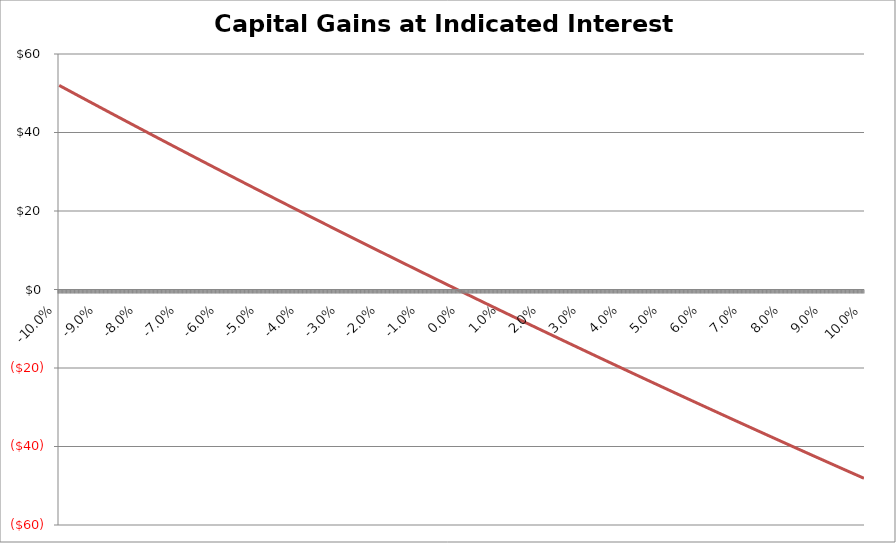
| Category | Capital Gains |
|---|---|
| -0.1 | 52 |
| -0.0999 | 51.945 |
| -0.0998 | 51.889 |
| -0.0997 | 51.834 |
| -0.0996 | 51.779 |
| -0.0995 | 51.723 |
| -0.0994 | 51.668 |
| -0.0993 | 51.613 |
| -0.0992 | 51.557 |
| -0.0991 | 51.502 |
| -0.099 | 51.447 |
| -0.0988999999999999 | 51.391 |
| -0.0987999999999999 | 51.336 |
| -0.0986999999999999 | 51.281 |
| -0.0985999999999999 | 51.225 |
| -0.0984999999999999 | 51.17 |
| -0.0983999999999999 | 51.115 |
| -0.0982999999999999 | 51.06 |
| -0.0981999999999999 | 51.004 |
| -0.0980999999999999 | 50.949 |
| -0.0979999999999999 | 50.894 |
| -0.0978999999999999 | 50.839 |
| -0.0977999999999999 | 50.783 |
| -0.0976999999999999 | 50.728 |
| -0.0975999999999999 | 50.673 |
| -0.0974999999999999 | 50.618 |
| -0.0973999999999999 | 50.562 |
| -0.0972999999999999 | 50.507 |
| -0.0971999999999999 | 50.452 |
| -0.0970999999999999 | 50.397 |
| -0.0969999999999999 | 50.342 |
| -0.0968999999999999 | 50.286 |
| -0.0967999999999999 | 50.231 |
| -0.0966999999999999 | 50.176 |
| -0.0965999999999999 | 50.121 |
| -0.0964999999999999 | 50.066 |
| -0.0963999999999999 | 50.011 |
| -0.0962999999999999 | 49.955 |
| -0.0961999999999999 | 49.9 |
| -0.0960999999999999 | 49.845 |
| -0.0959999999999999 | 49.79 |
| -0.0958999999999999 | 49.735 |
| -0.0957999999999999 | 49.68 |
| -0.0956999999999999 | 49.625 |
| -0.0955999999999999 | 49.569 |
| -0.0954999999999999 | 49.514 |
| -0.0953999999999998 | 49.459 |
| -0.0952999999999998 | 49.404 |
| -0.0951999999999998 | 49.349 |
| -0.0950999999999998 | 49.294 |
| -0.0949999999999998 | 49.239 |
| -0.0948999999999998 | 49.184 |
| -0.0947999999999998 | 49.129 |
| -0.0946999999999998 | 49.074 |
| -0.0945999999999998 | 49.019 |
| -0.0944999999999998 | 48.964 |
| -0.0943999999999998 | 48.908 |
| -0.0942999999999998 | 48.853 |
| -0.0941999999999998 | 48.798 |
| -0.0940999999999998 | 48.743 |
| -0.0939999999999998 | 48.688 |
| -0.0938999999999998 | 48.633 |
| -0.0937999999999998 | 48.578 |
| -0.0936999999999998 | 48.523 |
| -0.0935999999999998 | 48.468 |
| -0.0934999999999998 | 48.413 |
| -0.0933999999999998 | 48.358 |
| -0.0932999999999998 | 48.303 |
| -0.0931999999999998 | 48.248 |
| -0.0930999999999998 | 48.193 |
| -0.0929999999999998 | 48.138 |
| -0.0928999999999998 | 48.083 |
| -0.0927999999999998 | 48.029 |
| -0.0926999999999998 | 47.974 |
| -0.0925999999999998 | 47.919 |
| -0.0924999999999998 | 47.864 |
| -0.0923999999999998 | 47.809 |
| -0.0922999999999998 | 47.754 |
| -0.0921999999999998 | 47.699 |
| -0.0920999999999998 | 47.644 |
| -0.0919999999999998 | 47.589 |
| -0.0918999999999997 | 47.534 |
| -0.0917999999999997 | 47.479 |
| -0.0916999999999997 | 47.424 |
| -0.0915999999999997 | 47.37 |
| -0.0914999999999997 | 47.315 |
| -0.0913999999999997 | 47.26 |
| -0.0912999999999997 | 47.205 |
| -0.0911999999999997 | 47.15 |
| -0.0910999999999997 | 47.095 |
| -0.0909999999999997 | 47.04 |
| -0.0908999999999997 | 46.985 |
| -0.0907999999999997 | 46.931 |
| -0.0906999999999997 | 46.876 |
| -0.0905999999999997 | 46.821 |
| -0.0904999999999997 | 46.766 |
| -0.0903999999999997 | 46.711 |
| -0.0902999999999997 | 46.657 |
| -0.0901999999999997 | 46.602 |
| -0.0900999999999997 | 46.547 |
| -0.0899999999999997 | 46.492 |
| -0.0898999999999997 | 46.437 |
| -0.0897999999999997 | 46.383 |
| -0.0896999999999997 | 46.328 |
| -0.0895999999999997 | 46.273 |
| -0.0894999999999997 | 46.218 |
| -0.0893999999999997 | 46.164 |
| -0.0892999999999997 | 46.109 |
| -0.0891999999999997 | 46.054 |
| -0.0890999999999997 | 45.999 |
| -0.0889999999999997 | 45.945 |
| -0.0888999999999997 | 45.89 |
| -0.0887999999999997 | 45.835 |
| -0.0886999999999997 | 45.78 |
| -0.0885999999999997 | 45.726 |
| -0.0884999999999997 | 45.671 |
| -0.0883999999999997 | 45.616 |
| -0.0882999999999997 | 45.562 |
| -0.0881999999999997 | 45.507 |
| -0.0880999999999996 | 45.452 |
| -0.0879999999999996 | 45.397 |
| -0.0878999999999996 | 45.343 |
| -0.0877999999999996 | 45.288 |
| -0.0876999999999996 | 45.233 |
| -0.0875999999999996 | 45.179 |
| -0.0874999999999996 | 45.124 |
| -0.0873999999999996 | 45.07 |
| -0.0872999999999996 | 45.015 |
| -0.0871999999999996 | 44.96 |
| -0.0870999999999996 | 44.906 |
| -0.0869999999999996 | 44.851 |
| -0.0868999999999996 | 44.796 |
| -0.0867999999999996 | 44.742 |
| -0.0866999999999996 | 44.687 |
| -0.0865999999999996 | 44.633 |
| -0.0864999999999996 | 44.578 |
| -0.0863999999999996 | 44.523 |
| -0.0862999999999996 | 44.469 |
| -0.0861999999999996 | 44.414 |
| -0.0860999999999996 | 44.36 |
| -0.0859999999999996 | 44.305 |
| -0.0858999999999996 | 44.251 |
| -0.0857999999999996 | 44.196 |
| -0.0856999999999996 | 44.141 |
| -0.0855999999999996 | 44.087 |
| -0.0854999999999996 | 44.032 |
| -0.0853999999999996 | 43.978 |
| -0.0852999999999996 | 43.923 |
| -0.0851999999999996 | 43.869 |
| -0.0850999999999996 | 43.814 |
| -0.0849999999999996 | 43.76 |
| -0.0848999999999996 | 43.705 |
| -0.0847999999999996 | 43.651 |
| -0.0846999999999996 | 43.596 |
| -0.0845999999999995 | 43.542 |
| -0.0844999999999995 | 43.487 |
| -0.0843999999999995 | 43.433 |
| -0.0842999999999995 | 43.378 |
| -0.0841999999999995 | 43.324 |
| -0.0840999999999995 | 43.269 |
| -0.0839999999999995 | 43.215 |
| -0.0838999999999995 | 43.161 |
| -0.0837999999999995 | 43.106 |
| -0.0836999999999995 | 43.052 |
| -0.0835999999999995 | 42.997 |
| -0.0834999999999995 | 42.943 |
| -0.0833999999999995 | 42.888 |
| -0.0832999999999995 | 42.834 |
| -0.0831999999999995 | 42.78 |
| -0.0830999999999995 | 42.725 |
| -0.0829999999999995 | 42.671 |
| -0.0828999999999995 | 42.616 |
| -0.0827999999999995 | 42.562 |
| -0.0826999999999995 | 42.508 |
| -0.0825999999999995 | 42.453 |
| -0.0824999999999995 | 42.399 |
| -0.0823999999999995 | 42.345 |
| -0.0822999999999995 | 42.29 |
| -0.0821999999999995 | 42.236 |
| -0.0820999999999995 | 42.182 |
| -0.0819999999999995 | 42.127 |
| -0.0818999999999995 | 42.073 |
| -0.0817999999999995 | 42.019 |
| -0.0816999999999995 | 41.964 |
| -0.0815999999999995 | 41.91 |
| -0.0814999999999995 | 41.856 |
| -0.0813999999999995 | 41.801 |
| -0.0812999999999995 | 41.747 |
| -0.0811999999999995 | 41.693 |
| -0.0810999999999994 | 41.638 |
| -0.0809999999999994 | 41.584 |
| -0.0808999999999994 | 41.53 |
| -0.0807999999999994 | 41.476 |
| -0.0806999999999994 | 41.421 |
| -0.0805999999999994 | 41.367 |
| -0.0804999999999994 | 41.313 |
| -0.0803999999999994 | 41.259 |
| -0.0802999999999994 | 41.204 |
| -0.0801999999999994 | 41.15 |
| -0.0800999999999994 | 41.096 |
| -0.0799999999999994 | 41.042 |
| -0.0798999999999994 | 40.987 |
| -0.0797999999999994 | 40.933 |
| -0.0796999999999994 | 40.879 |
| -0.0795999999999994 | 40.825 |
| -0.0794999999999994 | 40.771 |
| -0.0793999999999994 | 40.716 |
| -0.0792999999999994 | 40.662 |
| -0.0791999999999994 | 40.608 |
| -0.0790999999999994 | 40.554 |
| -0.0789999999999994 | 40.5 |
| -0.0788999999999994 | 40.446 |
| -0.0787999999999994 | 40.391 |
| -0.0786999999999994 | 40.337 |
| -0.0785999999999994 | 40.283 |
| -0.0784999999999994 | 40.229 |
| -0.0783999999999994 | 40.175 |
| -0.0782999999999994 | 40.121 |
| -0.0781999999999994 | 40.067 |
| -0.0780999999999994 | 40.012 |
| -0.0779999999999994 | 39.958 |
| -0.0778999999999994 | 39.904 |
| -0.0777999999999994 | 39.85 |
| -0.0776999999999994 | 39.796 |
| -0.0775999999999994 | 39.742 |
| -0.0774999999999994 | 39.688 |
| -0.0773999999999993 | 39.634 |
| -0.0772999999999993 | 39.58 |
| -0.0771999999999993 | 39.526 |
| -0.0770999999999993 | 39.472 |
| -0.0769999999999993 | 39.418 |
| -0.0768999999999993 | 39.364 |
| -0.0767999999999993 | 39.309 |
| -0.0766999999999993 | 39.255 |
| -0.0765999999999993 | 39.201 |
| -0.0764999999999993 | 39.147 |
| -0.0763999999999993 | 39.093 |
| -0.0762999999999993 | 39.039 |
| -0.0761999999999993 | 38.985 |
| -0.0760999999999993 | 38.931 |
| -0.0759999999999993 | 38.877 |
| -0.0758999999999993 | 38.823 |
| -0.0757999999999993 | 38.769 |
| -0.0756999999999993 | 38.715 |
| -0.0755999999999993 | 38.661 |
| -0.0754999999999993 | 38.607 |
| -0.0753999999999993 | 38.553 |
| -0.0752999999999993 | 38.5 |
| -0.0751999999999993 | 38.446 |
| -0.0750999999999993 | 38.392 |
| -0.0749999999999993 | 38.338 |
| -0.0748999999999993 | 38.284 |
| -0.0747999999999993 | 38.23 |
| -0.0746999999999993 | 38.176 |
| -0.0745999999999993 | 38.122 |
| -0.0744999999999993 | 38.068 |
| -0.0743999999999993 | 38.014 |
| -0.0742999999999993 | 37.96 |
| -0.0741999999999993 | 37.906 |
| -0.0740999999999993 | 37.852 |
| -0.0739999999999993 | 37.799 |
| -0.0738999999999993 | 37.745 |
| -0.0737999999999992 | 37.691 |
| -0.0736999999999992 | 37.637 |
| -0.0735999999999992 | 37.583 |
| -0.0734999999999992 | 37.529 |
| -0.0733999999999992 | 37.475 |
| -0.0732999999999992 | 37.421 |
| -0.0731999999999992 | 37.368 |
| -0.0730999999999992 | 37.314 |
| -0.0729999999999992 | 37.26 |
| -0.0728999999999992 | 37.206 |
| -0.0727999999999992 | 37.152 |
| -0.0726999999999992 | 37.099 |
| -0.0725999999999992 | 37.045 |
| -0.0724999999999992 | 36.991 |
| -0.0723999999999992 | 36.937 |
| -0.0722999999999992 | 36.883 |
| -0.0721999999999992 | 36.83 |
| -0.0720999999999992 | 36.776 |
| -0.0719999999999992 | 36.722 |
| -0.0718999999999992 | 36.668 |
| -0.0717999999999992 | 36.614 |
| -0.0716999999999992 | 36.561 |
| -0.0715999999999992 | 36.507 |
| -0.0714999999999992 | 36.453 |
| -0.0713999999999992 | 36.399 |
| -0.0712999999999992 | 36.346 |
| -0.0711999999999992 | 36.292 |
| -0.0710999999999992 | 36.238 |
| -0.0709999999999992 | 36.185 |
| -0.0708999999999992 | 36.131 |
| -0.0707999999999992 | 36.077 |
| -0.0706999999999992 | 36.023 |
| -0.0705999999999992 | 35.97 |
| -0.0704999999999992 | 35.916 |
| -0.0703999999999992 | 35.862 |
| -0.0702999999999991 | 35.809 |
| -0.0701999999999991 | 35.755 |
| -0.0700999999999991 | 35.701 |
| -0.0699999999999991 | 35.648 |
| -0.0698999999999991 | 35.594 |
| -0.0697999999999991 | 35.54 |
| -0.0696999999999991 | 35.487 |
| -0.0695999999999991 | 35.433 |
| -0.0694999999999991 | 35.379 |
| -0.0693999999999991 | 35.326 |
| -0.0692999999999991 | 35.272 |
| -0.0691999999999991 | 35.219 |
| -0.0690999999999991 | 35.165 |
| -0.0689999999999991 | 35.111 |
| -0.0688999999999991 | 35.058 |
| -0.0687999999999991 | 35.004 |
| -0.0686999999999991 | 34.951 |
| -0.0685999999999991 | 34.897 |
| -0.0684999999999991 | 34.843 |
| -0.0683999999999991 | 34.79 |
| -0.0682999999999991 | 34.736 |
| -0.0681999999999991 | 34.683 |
| -0.0680999999999991 | 34.629 |
| -0.0679999999999991 | 34.576 |
| -0.0678999999999991 | 34.522 |
| -0.0677999999999991 | 34.468 |
| -0.0676999999999991 | 34.415 |
| -0.0675999999999991 | 34.361 |
| -0.0674999999999991 | 34.308 |
| -0.0673999999999991 | 34.254 |
| -0.0672999999999991 | 34.201 |
| -0.0671999999999991 | 34.147 |
| -0.067099999999999 | 34.094 |
| -0.066999999999999 | 34.04 |
| -0.066899999999999 | 33.987 |
| -0.066799999999999 | 33.933 |
| -0.066699999999999 | 33.88 |
| -0.066599999999999 | 33.826 |
| -0.066499999999999 | 33.773 |
| -0.066399999999999 | 33.719 |
| -0.066299999999999 | 33.666 |
| -0.066199999999999 | 33.613 |
| -0.066099999999999 | 33.559 |
| -0.065999999999999 | 33.506 |
| -0.065899999999999 | 33.452 |
| -0.065799999999999 | 33.399 |
| -0.065699999999999 | 33.345 |
| -0.065599999999999 | 33.292 |
| -0.065499999999999 | 33.239 |
| -0.065399999999999 | 33.185 |
| -0.065299999999999 | 33.132 |
| -0.065199999999999 | 33.078 |
| -0.065099999999999 | 33.025 |
| -0.064999999999999 | 32.972 |
| -0.064899999999999 | 32.918 |
| -0.064799999999999 | 32.865 |
| -0.064699999999999 | 32.811 |
| -0.064599999999999 | 32.758 |
| -0.064499999999999 | 32.705 |
| -0.064399999999999 | 32.651 |
| -0.064299999999999 | 32.598 |
| -0.064199999999999 | 32.545 |
| -0.064099999999999 | 32.491 |
| -0.063999999999999 | 32.438 |
| -0.063899999999999 | 32.385 |
| -0.063799999999999 | 32.331 |
| -0.063699999999999 | 32.278 |
| -0.063599999999999 | 32.225 |
| -0.0634999999999989 | 32.171 |
| -0.0633999999999989 | 32.118 |
| -0.0632999999999989 | 32.065 |
| -0.0631999999999989 | 32.012 |
| -0.0630999999999989 | 31.958 |
| -0.0629999999999989 | 31.905 |
| -0.0628999999999989 | 31.852 |
| -0.0627999999999989 | 31.798 |
| -0.0626999999999989 | 31.745 |
| -0.0625999999999989 | 31.692 |
| -0.0624999999999989 | 31.639 |
| -0.0623999999999989 | 31.585 |
| -0.0622999999999989 | 31.532 |
| -0.0621999999999989 | 31.479 |
| -0.0620999999999989 | 31.426 |
| -0.0619999999999989 | 31.373 |
| -0.0618999999999989 | 31.319 |
| -0.0617999999999989 | 31.266 |
| -0.0616999999999989 | 31.213 |
| -0.0615999999999989 | 31.16 |
| -0.0614999999999989 | 31.107 |
| -0.0613999999999989 | 31.053 |
| -0.0612999999999989 | 31 |
| -0.0611999999999989 | 30.947 |
| -0.0610999999999989 | 30.894 |
| -0.0609999999999989 | 30.841 |
| -0.0608999999999989 | 30.787 |
| -0.0607999999999989 | 30.734 |
| -0.0606999999999989 | 30.681 |
| -0.0605999999999989 | 30.628 |
| -0.0604999999999989 | 30.575 |
| -0.0603999999999989 | 30.522 |
| -0.0602999999999989 | 30.469 |
| -0.0601999999999989 | 30.416 |
| -0.0600999999999989 | 30.362 |
| -0.0599999999999988 | 30.309 |
| -0.0598999999999988 | 30.256 |
| -0.0597999999999988 | 30.203 |
| -0.0596999999999988 | 30.15 |
| -0.0595999999999988 | 30.097 |
| -0.0594999999999988 | 30.044 |
| -0.0593999999999988 | 29.991 |
| -0.0592999999999988 | 29.938 |
| -0.0591999999999988 | 29.885 |
| -0.0590999999999988 | 29.832 |
| -0.0589999999999988 | 29.778 |
| -0.0588999999999988 | 29.725 |
| -0.0587999999999988 | 29.672 |
| -0.0586999999999988 | 29.619 |
| -0.0585999999999988 | 29.566 |
| -0.0584999999999988 | 29.513 |
| -0.0583999999999988 | 29.46 |
| -0.0582999999999988 | 29.407 |
| -0.0581999999999988 | 29.354 |
| -0.0580999999999988 | 29.301 |
| -0.0579999999999988 | 29.248 |
| -0.0578999999999988 | 29.195 |
| -0.0577999999999988 | 29.142 |
| -0.0576999999999988 | 29.089 |
| -0.0575999999999988 | 29.036 |
| -0.0574999999999988 | 28.983 |
| -0.0573999999999988 | 28.93 |
| -0.0572999999999988 | 28.877 |
| -0.0571999999999988 | 28.824 |
| -0.0570999999999988 | 28.771 |
| -0.0569999999999988 | 28.718 |
| -0.0568999999999988 | 28.666 |
| -0.0567999999999988 | 28.613 |
| -0.0566999999999988 | 28.56 |
| -0.0565999999999988 | 28.507 |
| -0.0564999999999987 | 28.454 |
| -0.0563999999999987 | 28.401 |
| -0.0562999999999987 | 28.348 |
| -0.0561999999999987 | 28.295 |
| -0.0560999999999987 | 28.242 |
| -0.0559999999999987 | 28.189 |
| -0.0558999999999987 | 28.136 |
| -0.0557999999999987 | 28.084 |
| -0.0556999999999987 | 28.031 |
| -0.0555999999999987 | 27.978 |
| -0.0554999999999987 | 27.925 |
| -0.0553999999999987 | 27.872 |
| -0.0552999999999987 | 27.819 |
| -0.0551999999999987 | 27.766 |
| -0.0550999999999987 | 27.714 |
| -0.0549999999999987 | 27.661 |
| -0.0548999999999987 | 27.608 |
| -0.0547999999999987 | 27.555 |
| -0.0546999999999987 | 27.502 |
| -0.0545999999999987 | 27.449 |
| -0.0544999999999987 | 27.397 |
| -0.0543999999999987 | 27.344 |
| -0.0542999999999987 | 27.291 |
| -0.0541999999999987 | 27.238 |
| -0.0540999999999987 | 27.185 |
| -0.0539999999999987 | 27.133 |
| -0.0538999999999987 | 27.08 |
| -0.0537999999999987 | 27.027 |
| -0.0536999999999987 | 26.974 |
| -0.0535999999999987 | 26.921 |
| -0.0534999999999987 | 26.869 |
| -0.0533999999999987 | 26.816 |
| -0.0532999999999987 | 26.763 |
| -0.0531999999999987 | 26.71 |
| -0.0530999999999987 | 26.658 |
| -0.0529999999999986 | 26.605 |
| -0.0528999999999986 | 26.552 |
| -0.0527999999999986 | 26.5 |
| -0.0526999999999986 | 26.447 |
| -0.0525999999999986 | 26.394 |
| -0.0524999999999986 | 26.341 |
| -0.0523999999999986 | 26.289 |
| -0.0522999999999986 | 26.236 |
| -0.0521999999999986 | 26.183 |
| -0.0520999999999986 | 26.131 |
| -0.0519999999999986 | 26.078 |
| -0.0518999999999986 | 26.025 |
| -0.0517999999999986 | 25.973 |
| -0.0516999999999986 | 25.92 |
| -0.0515999999999986 | 25.867 |
| -0.0514999999999986 | 25.815 |
| -0.0513999999999986 | 25.762 |
| -0.0512999999999986 | 25.709 |
| -0.0511999999999986 | 25.657 |
| -0.0510999999999986 | 25.604 |
| -0.0509999999999986 | 25.552 |
| -0.0508999999999986 | 25.499 |
| -0.0507999999999986 | 25.446 |
| -0.0506999999999986 | 25.394 |
| -0.0505999999999986 | 25.341 |
| -0.0504999999999986 | 25.289 |
| -0.0503999999999986 | 25.236 |
| -0.0502999999999986 | 25.183 |
| -0.0501999999999986 | 25.131 |
| -0.0500999999999986 | 25.078 |
| -0.0499999999999986 | 25.026 |
| -0.0498999999999986 | 24.973 |
| -0.0497999999999986 | 24.921 |
| -0.0496999999999986 | 24.868 |
| -0.0495999999999986 | 24.815 |
| -0.0494999999999985 | 24.763 |
| -0.0493999999999985 | 24.71 |
| -0.0492999999999985 | 24.658 |
| -0.0491999999999985 | 24.605 |
| -0.0490999999999985 | 24.553 |
| -0.0489999999999985 | 24.5 |
| -0.0488999999999985 | 24.448 |
| -0.0487999999999985 | 24.395 |
| -0.0486999999999985 | 24.343 |
| -0.0485999999999985 | 24.29 |
| -0.0484999999999985 | 24.238 |
| -0.0483999999999985 | 24.185 |
| -0.0482999999999985 | 24.133 |
| -0.0481999999999985 | 24.08 |
| -0.0480999999999985 | 24.028 |
| -0.0479999999999985 | 23.975 |
| -0.0478999999999985 | 23.923 |
| -0.0477999999999985 | 23.871 |
| -0.0476999999999985 | 23.818 |
| -0.0475999999999985 | 23.766 |
| -0.0474999999999985 | 23.713 |
| -0.0473999999999985 | 23.661 |
| -0.0472999999999985 | 23.608 |
| -0.0471999999999985 | 23.556 |
| -0.0470999999999985 | 23.504 |
| -0.0469999999999985 | 23.451 |
| -0.0468999999999985 | 23.399 |
| -0.0467999999999985 | 23.346 |
| -0.0466999999999985 | 23.294 |
| -0.0465999999999985 | 23.242 |
| -0.0464999999999985 | 23.189 |
| -0.0463999999999985 | 23.137 |
| -0.0462999999999985 | 23.084 |
| -0.0461999999999985 | 23.032 |
| -0.0460999999999985 | 22.98 |
| -0.0459999999999984 | 22.927 |
| -0.0458999999999984 | 22.875 |
| -0.0457999999999984 | 22.823 |
| -0.0456999999999984 | 22.77 |
| -0.0455999999999984 | 22.718 |
| -0.0454999999999984 | 22.666 |
| -0.0453999999999984 | 22.613 |
| -0.0452999999999984 | 22.561 |
| -0.0451999999999984 | 22.509 |
| -0.0450999999999984 | 22.456 |
| -0.0449999999999984 | 22.404 |
| -0.0448999999999984 | 22.352 |
| -0.0447999999999984 | 22.3 |
| -0.0446999999999984 | 22.247 |
| -0.0445999999999984 | 22.195 |
| -0.0444999999999984 | 22.143 |
| -0.0443999999999984 | 22.09 |
| -0.0442999999999984 | 22.038 |
| -0.0441999999999984 | 21.986 |
| -0.0440999999999984 | 21.934 |
| -0.0439999999999984 | 21.881 |
| -0.0438999999999984 | 21.829 |
| -0.0437999999999984 | 21.777 |
| -0.0436999999999984 | 21.725 |
| -0.0435999999999984 | 21.672 |
| -0.0434999999999984 | 21.62 |
| -0.0433999999999984 | 21.568 |
| -0.0432999999999984 | 21.516 |
| -0.0431999999999984 | 21.464 |
| -0.0430999999999984 | 21.411 |
| -0.0429999999999984 | 21.359 |
| -0.0428999999999984 | 21.307 |
| -0.0427999999999984 | 21.255 |
| -0.0426999999999984 | 21.203 |
| -0.0425999999999984 | 21.151 |
| -0.0424999999999984 | 21.098 |
| -0.0423999999999983 | 21.046 |
| -0.0422999999999983 | 20.994 |
| -0.0421999999999983 | 20.942 |
| -0.0420999999999983 | 20.89 |
| -0.0419999999999983 | 20.838 |
| -0.0418999999999983 | 20.785 |
| -0.0417999999999983 | 20.733 |
| -0.0416999999999983 | 20.681 |
| -0.0415999999999983 | 20.629 |
| -0.0414999999999983 | 20.577 |
| -0.0413999999999983 | 20.525 |
| -0.0412999999999983 | 20.473 |
| -0.0411999999999983 | 20.421 |
| -0.0410999999999983 | 20.369 |
| -0.0409999999999983 | 20.316 |
| -0.0408999999999983 | 20.264 |
| -0.0407999999999983 | 20.212 |
| -0.0406999999999983 | 20.16 |
| -0.0405999999999983 | 20.108 |
| -0.0404999999999983 | 20.056 |
| -0.0403999999999983 | 20.004 |
| -0.0402999999999983 | 19.952 |
| -0.0401999999999983 | 19.9 |
| -0.0400999999999983 | 19.848 |
| -0.0399999999999983 | 19.796 |
| -0.0398999999999983 | 19.744 |
| -0.0397999999999983 | 19.692 |
| -0.0396999999999983 | 19.64 |
| -0.0395999999999983 | 19.588 |
| -0.0394999999999983 | 19.536 |
| -0.0393999999999983 | 19.484 |
| -0.0392999999999983 | 19.432 |
| -0.0391999999999983 | 19.38 |
| -0.0390999999999983 | 19.328 |
| -0.0389999999999983 | 19.276 |
| -0.0388999999999982 | 19.224 |
| -0.0387999999999982 | 19.172 |
| -0.0386999999999982 | 19.12 |
| -0.0385999999999982 | 19.068 |
| -0.0384999999999982 | 19.016 |
| -0.0383999999999982 | 18.964 |
| -0.0382999999999982 | 18.912 |
| -0.0381999999999982 | 18.86 |
| -0.0380999999999982 | 18.808 |
| -0.0379999999999982 | 18.756 |
| -0.0378999999999982 | 18.704 |
| -0.0377999999999982 | 18.653 |
| -0.0376999999999982 | 18.601 |
| -0.0375999999999982 | 18.549 |
| -0.0374999999999982 | 18.497 |
| -0.0373999999999982 | 18.445 |
| -0.0372999999999982 | 18.393 |
| -0.0371999999999982 | 18.341 |
| -0.0370999999999982 | 18.289 |
| -0.0369999999999982 | 18.237 |
| -0.0368999999999982 | 18.186 |
| -0.0367999999999982 | 18.134 |
| -0.0366999999999982 | 18.082 |
| -0.0365999999999982 | 18.03 |
| -0.0364999999999982 | 17.978 |
| -0.0363999999999982 | 17.926 |
| -0.0362999999999982 | 17.874 |
| -0.0361999999999982 | 17.823 |
| -0.0360999999999982 | 17.771 |
| -0.0359999999999982 | 17.719 |
| -0.0358999999999982 | 17.667 |
| -0.0357999999999982 | 17.615 |
| -0.0356999999999982 | 17.564 |
| -0.0355999999999982 | 17.512 |
| -0.0354999999999982 | 17.46 |
| -0.0353999999999981 | 17.408 |
| -0.0352999999999981 | 17.356 |
| -0.0351999999999981 | 17.305 |
| -0.0350999999999981 | 17.253 |
| -0.0349999999999981 | 17.201 |
| -0.0348999999999981 | 17.149 |
| -0.0347999999999981 | 17.097 |
| -0.0346999999999981 | 17.046 |
| -0.0345999999999981 | 16.994 |
| -0.0344999999999981 | 16.942 |
| -0.0343999999999981 | 16.891 |
| -0.0342999999999981 | 16.839 |
| -0.0341999999999981 | 16.787 |
| -0.0340999999999981 | 16.735 |
| -0.0339999999999981 | 16.684 |
| -0.0338999999999981 | 16.632 |
| -0.0337999999999981 | 16.58 |
| -0.0336999999999981 | 16.529 |
| -0.0335999999999981 | 16.477 |
| -0.0334999999999981 | 16.425 |
| -0.0333999999999981 | 16.373 |
| -0.0332999999999981 | 16.322 |
| -0.0331999999999981 | 16.27 |
| -0.0330999999999981 | 16.218 |
| -0.0329999999999981 | 16.167 |
| -0.0328999999999981 | 16.115 |
| -0.0327999999999981 | 16.063 |
| -0.0326999999999981 | 16.012 |
| -0.0325999999999981 | 15.96 |
| -0.0324999999999981 | 15.909 |
| -0.0323999999999981 | 15.857 |
| -0.0322999999999981 | 15.805 |
| -0.0321999999999981 | 15.754 |
| -0.0320999999999981 | 15.702 |
| -0.0319999999999981 | 15.65 |
| -0.031899999999998 | 15.599 |
| -0.031799999999998 | 15.547 |
| -0.031699999999998 | 15.496 |
| -0.031599999999998 | 15.444 |
| -0.031499999999998 | 15.392 |
| -0.031399999999998 | 15.341 |
| -0.031299999999998 | 15.289 |
| -0.031199999999998 | 15.238 |
| -0.031099999999998 | 15.186 |
| -0.030999999999998 | 15.135 |
| -0.030899999999998 | 15.083 |
| -0.030799999999998 | 15.031 |
| -0.030699999999998 | 14.98 |
| -0.030599999999998 | 14.928 |
| -0.030499999999998 | 14.877 |
| -0.030399999999998 | 14.825 |
| -0.030299999999998 | 14.774 |
| -0.030199999999998 | 14.722 |
| -0.030099999999998 | 14.671 |
| -0.029999999999998 | 14.619 |
| -0.029899999999998 | 14.568 |
| -0.029799999999998 | 14.516 |
| -0.029699999999998 | 14.465 |
| -0.029599999999998 | 14.413 |
| -0.029499999999998 | 14.362 |
| -0.029399999999998 | 14.31 |
| -0.029299999999998 | 14.259 |
| -0.029199999999998 | 14.207 |
| -0.029099999999998 | 14.156 |
| -0.028999999999998 | 14.105 |
| -0.028899999999998 | 14.053 |
| -0.028799999999998 | 14.002 |
| -0.028699999999998 | 13.95 |
| -0.028599999999998 | 13.899 |
| -0.028499999999998 | 13.847 |
| -0.028399999999998 | 13.796 |
| -0.028299999999998 | 13.744 |
| -0.0281999999999981 | 13.693 |
| -0.0280999999999981 | 13.642 |
| -0.0279999999999981 | 13.59 |
| -0.0278999999999981 | 13.539 |
| -0.0277999999999981 | 13.487 |
| -0.0276999999999981 | 13.436 |
| -0.0275999999999981 | 13.385 |
| -0.0274999999999981 | 13.333 |
| -0.0273999999999981 | 13.282 |
| -0.0272999999999981 | 13.231 |
| -0.0271999999999981 | 13.179 |
| -0.0270999999999981 | 13.128 |
| -0.0269999999999981 | 13.077 |
| -0.0268999999999981 | 13.025 |
| -0.0267999999999981 | 12.974 |
| -0.0266999999999981 | 12.923 |
| -0.0265999999999981 | 12.871 |
| -0.0264999999999981 | 12.82 |
| -0.0263999999999981 | 12.769 |
| -0.0262999999999981 | 12.717 |
| -0.0261999999999981 | 12.666 |
| -0.0260999999999981 | 12.615 |
| -0.0259999999999981 | 12.563 |
| -0.0258999999999981 | 12.512 |
| -0.0257999999999981 | 12.461 |
| -0.0256999999999981 | 12.409 |
| -0.0255999999999981 | 12.358 |
| -0.0254999999999981 | 12.307 |
| -0.0253999999999981 | 12.256 |
| -0.0252999999999981 | 12.204 |
| -0.0251999999999981 | 12.153 |
| -0.0250999999999981 | 12.102 |
| -0.0249999999999981 | 12.051 |
| -0.0248999999999981 | 11.999 |
| -0.0247999999999981 | 11.948 |
| -0.0246999999999981 | 11.897 |
| -0.0245999999999981 | 11.846 |
| -0.0244999999999981 | 11.794 |
| -0.0243999999999981 | 11.743 |
| -0.0242999999999981 | 11.692 |
| -0.0241999999999981 | 11.641 |
| -0.0240999999999981 | 11.59 |
| -0.0239999999999981 | 11.538 |
| -0.0238999999999981 | 11.487 |
| -0.0237999999999981 | 11.436 |
| -0.0236999999999981 | 11.385 |
| -0.0235999999999981 | 11.334 |
| -0.0234999999999981 | 11.283 |
| -0.0233999999999981 | 11.231 |
| -0.0232999999999981 | 11.18 |
| -0.0231999999999981 | 11.129 |
| -0.0230999999999981 | 11.078 |
| -0.0229999999999981 | 11.027 |
| -0.0228999999999981 | 10.976 |
| -0.0227999999999981 | 10.925 |
| -0.0226999999999981 | 10.873 |
| -0.0225999999999981 | 10.822 |
| -0.0224999999999981 | 10.771 |
| -0.0223999999999981 | 10.72 |
| -0.0222999999999981 | 10.669 |
| -0.0221999999999981 | 10.618 |
| -0.0220999999999981 | 10.567 |
| -0.0219999999999981 | 10.516 |
| -0.0218999999999981 | 10.465 |
| -0.0217999999999981 | 10.414 |
| -0.0216999999999981 | 10.362 |
| -0.0215999999999981 | 10.311 |
| -0.0214999999999981 | 10.26 |
| -0.0213999999999981 | 10.209 |
| -0.0212999999999981 | 10.158 |
| -0.0211999999999981 | 10.107 |
| -0.0210999999999981 | 10.056 |
| -0.0209999999999981 | 10.005 |
| -0.0208999999999981 | 9.954 |
| -0.0207999999999981 | 9.903 |
| -0.0206999999999981 | 9.852 |
| -0.0205999999999981 | 9.801 |
| -0.0204999999999981 | 9.75 |
| -0.0203999999999981 | 9.699 |
| -0.0202999999999981 | 9.648 |
| -0.0201999999999981 | 9.597 |
| -0.0200999999999981 | 9.546 |
| -0.0199999999999981 | 9.495 |
| -0.0198999999999981 | 9.444 |
| -0.0197999999999981 | 9.393 |
| -0.0196999999999981 | 9.342 |
| -0.0195999999999981 | 9.291 |
| -0.0194999999999981 | 9.24 |
| -0.0193999999999981 | 9.189 |
| -0.0192999999999981 | 9.138 |
| -0.0191999999999981 | 9.087 |
| -0.0190999999999981 | 9.036 |
| -0.0189999999999981 | 8.985 |
| -0.0188999999999981 | 8.934 |
| -0.0187999999999981 | 8.884 |
| -0.0186999999999981 | 8.833 |
| -0.0185999999999981 | 8.782 |
| -0.0184999999999981 | 8.731 |
| -0.0183999999999981 | 8.68 |
| -0.0182999999999981 | 8.629 |
| -0.0181999999999981 | 8.578 |
| -0.0180999999999981 | 8.527 |
| -0.0179999999999981 | 8.476 |
| -0.0178999999999981 | 8.425 |
| -0.0177999999999981 | 8.375 |
| -0.0176999999999981 | 8.324 |
| -0.0175999999999981 | 8.273 |
| -0.0174999999999981 | 8.222 |
| -0.0173999999999981 | 8.171 |
| -0.0172999999999981 | 8.12 |
| -0.0171999999999981 | 8.069 |
| -0.0170999999999981 | 8.019 |
| -0.0169999999999981 | 7.968 |
| -0.0168999999999981 | 7.917 |
| -0.0167999999999981 | 7.866 |
| -0.0166999999999981 | 7.815 |
| -0.0165999999999981 | 7.764 |
| -0.0164999999999981 | 7.714 |
| -0.0163999999999981 | 7.663 |
| -0.0162999999999981 | 7.612 |
| -0.0161999999999981 | 7.561 |
| -0.0160999999999981 | 7.51 |
| -0.0159999999999981 | 7.46 |
| -0.0158999999999981 | 7.409 |
| -0.0157999999999981 | 7.358 |
| -0.0156999999999981 | 7.307 |
| -0.0155999999999981 | 7.257 |
| -0.0154999999999981 | 7.206 |
| -0.0153999999999981 | 7.155 |
| -0.0152999999999981 | 7.104 |
| -0.0151999999999981 | 7.054 |
| -0.0150999999999981 | 7.003 |
| -0.0149999999999981 | 6.952 |
| -0.0148999999999981 | 6.901 |
| -0.0147999999999981 | 6.851 |
| -0.0146999999999981 | 6.8 |
| -0.0145999999999981 | 6.749 |
| -0.0144999999999981 | 6.699 |
| -0.0143999999999981 | 6.648 |
| -0.0142999999999981 | 6.597 |
| -0.0141999999999981 | 6.546 |
| -0.0140999999999981 | 6.496 |
| -0.0139999999999981 | 6.445 |
| -0.0138999999999981 | 6.394 |
| -0.0137999999999981 | 6.344 |
| -0.0136999999999981 | 6.293 |
| -0.0135999999999981 | 6.242 |
| -0.0134999999999981 | 6.192 |
| -0.0133999999999981 | 6.141 |
| -0.0132999999999981 | 6.091 |
| -0.0131999999999981 | 6.04 |
| -0.0130999999999981 | 5.989 |
| -0.0129999999999981 | 5.939 |
| -0.0128999999999981 | 5.888 |
| -0.0127999999999981 | 5.837 |
| -0.0126999999999981 | 5.787 |
| -0.0125999999999981 | 5.736 |
| -0.0124999999999981 | 5.686 |
| -0.0123999999999981 | 5.635 |
| -0.0122999999999982 | 5.584 |
| -0.0121999999999982 | 5.534 |
| -0.0120999999999982 | 5.483 |
| -0.0119999999999982 | 5.433 |
| -0.0118999999999982 | 5.382 |
| -0.0117999999999982 | 5.331 |
| -0.0116999999999982 | 5.281 |
| -0.0115999999999982 | 5.23 |
| -0.0114999999999982 | 5.18 |
| -0.0113999999999982 | 5.129 |
| -0.0112999999999982 | 5.079 |
| -0.0111999999999982 | 5.028 |
| -0.0110999999999982 | 4.978 |
| -0.0109999999999982 | 4.927 |
| -0.0108999999999982 | 4.877 |
| -0.0107999999999982 | 4.826 |
| -0.0106999999999982 | 4.776 |
| -0.0105999999999982 | 4.725 |
| -0.0104999999999982 | 4.675 |
| -0.0103999999999982 | 4.624 |
| -0.0102999999999982 | 4.574 |
| -0.0101999999999982 | 4.523 |
| -0.0100999999999982 | 4.473 |
| -0.00999999999999816 | 4.422 |
| -0.00989999999999816 | 4.372 |
| -0.00979999999999816 | 4.321 |
| -0.00969999999999817 | 4.271 |
| -0.00959999999999817 | 4.22 |
| -0.00949999999999817 | 4.17 |
| -0.00939999999999817 | 4.119 |
| -0.00929999999999817 | 4.069 |
| -0.00919999999999817 | 4.018 |
| -0.00909999999999817 | 3.968 |
| -0.00899999999999817 | 3.918 |
| -0.00889999999999817 | 3.867 |
| -0.00879999999999817 | 3.817 |
| -0.00869999999999817 | 3.766 |
| -0.00859999999999817 | 3.716 |
| -0.00849999999999817 | 3.666 |
| -0.00839999999999817 | 3.615 |
| -0.00829999999999817 | 3.565 |
| -0.00819999999999818 | 3.514 |
| -0.00809999999999818 | 3.464 |
| -0.00799999999999818 | 3.414 |
| -0.00789999999999818 | 3.363 |
| -0.00779999999999818 | 3.313 |
| -0.00769999999999818 | 3.263 |
| -0.00759999999999818 | 3.212 |
| -0.00749999999999818 | 3.162 |
| -0.00739999999999818 | 3.112 |
| -0.00729999999999818 | 3.061 |
| -0.00719999999999818 | 3.011 |
| -0.00709999999999818 | 2.961 |
| -0.00699999999999817 | 2.91 |
| -0.00689999999999817 | 2.86 |
| -0.00679999999999817 | 2.81 |
| -0.00669999999999817 | 2.759 |
| -0.00659999999999817 | 2.709 |
| -0.00649999999999817 | 2.659 |
| -0.00639999999999817 | 2.608 |
| -0.00629999999999817 | 2.558 |
| -0.00619999999999817 | 2.508 |
| -0.00609999999999817 | 2.457 |
| -0.00599999999999817 | 2.407 |
| -0.00589999999999817 | 2.357 |
| -0.00579999999999817 | 2.307 |
| -0.00569999999999817 | 2.256 |
| -0.00559999999999817 | 2.206 |
| -0.00549999999999817 | 2.156 |
| -0.00539999999999817 | 2.106 |
| -0.00529999999999817 | 2.055 |
| -0.00519999999999817 | 2.005 |
| -0.00509999999999817 | 1.955 |
| -0.00499999999999817 | 1.905 |
| -0.00489999999999817 | 1.855 |
| -0.00479999999999817 | 1.804 |
| -0.00469999999999817 | 1.754 |
| -0.00459999999999817 | 1.704 |
| -0.00449999999999817 | 1.654 |
| -0.00439999999999817 | 1.604 |
| -0.00429999999999817 | 1.553 |
| -0.00419999999999817 | 1.503 |
| -0.00409999999999817 | 1.453 |
| -0.00399999999999817 | 1.403 |
| -0.00389999999999817 | 1.353 |
| -0.00379999999999817 | 1.302 |
| -0.00369999999999817 | 1.252 |
| -0.00359999999999817 | 1.202 |
| -0.00349999999999817 | 1.152 |
| -0.00339999999999817 | 1.102 |
| -0.00329999999999817 | 1.052 |
| -0.00319999999999817 | 1.002 |
| -0.00309999999999817 | 0.951 |
| -0.00299999999999817 | 0.901 |
| -0.00289999999999817 | 0.851 |
| -0.00279999999999817 | 0.801 |
| -0.00269999999999817 | 0.751 |
| -0.00259999999999817 | 0.701 |
| -0.00249999999999817 | 0.651 |
| -0.00239999999999817 | 0.601 |
| -0.00229999999999817 | 0.551 |
| -0.00219999999999817 | 0.501 |
| -0.00209999999999817 | 0.45 |
| -0.00199999999999817 | 0.4 |
| -0.00189999999999817 | 0.35 |
| -0.00179999999999817 | 0.3 |
| -0.00169999999999817 | 0.25 |
| -0.00159999999999817 | 0.2 |
| -0.00149999999999817 | 0.15 |
| -0.00139999999999817 | 0.1 |
| -0.00129999999999817 | 0.05 |
| -0.00119999999999817 | 0 |
| -0.00109999999999817 | -0.05 |
| -0.000999999999998172 | -0.1 |
| -0.000899999999998172 | -0.15 |
| -0.000799999999998172 | -0.2 |
| -0.000699999999998172 | -0.25 |
| -0.000599999999998172 | -0.3 |
| -0.000499999999998172 | -0.35 |
| -0.000399999999998172 | -0.4 |
| -0.000299999999998172 | -0.45 |
| -0.000199999999998172 | -0.5 |
| -9.99999999981718e-05 | -0.55 |
| 1.82815459819075e-15 | -0.583 |
| 0.000100000000001828 | -0.65 |
| 0.000200000000001828 | -0.7 |
| 0.000300000000001828 | -0.75 |
| 0.000400000000001828 | -0.8 |
| 0.000500000000001828 | -0.85 |
| 0.000600000000001828 | -0.9 |
| 0.000700000000001828 | -0.95 |
| 0.000800000000001828 | -1 |
| 0.000900000000001828 | -1.05 |
| 0.00100000000000183 | -1.099 |
| 0.00110000000000183 | -1.149 |
| 0.00120000000000183 | -1.199 |
| 0.00130000000000183 | -1.249 |
| 0.00140000000000183 | -1.299 |
| 0.00150000000000183 | -1.349 |
| 0.00160000000000183 | -1.399 |
| 0.00170000000000183 | -1.449 |
| 0.00180000000000183 | -1.499 |
| 0.00190000000000183 | -1.549 |
| 0.00200000000000183 | -1.598 |
| 0.00210000000000183 | -1.648 |
| 0.00220000000000183 | -1.698 |
| 0.00230000000000183 | -1.748 |
| 0.00240000000000183 | -1.798 |
| 0.00250000000000183 | -1.848 |
| 0.00260000000000183 | -1.898 |
| 0.00270000000000183 | -1.947 |
| 0.00280000000000183 | -1.997 |
| 0.00290000000000183 | -2.047 |
| 0.00300000000000183 | -2.097 |
| 0.00310000000000183 | -2.147 |
| 0.00320000000000183 | -2.196 |
| 0.00330000000000183 | -2.246 |
| 0.00340000000000183 | -2.296 |
| 0.00350000000000183 | -2.346 |
| 0.00360000000000183 | -2.396 |
| 0.00370000000000182 | -2.445 |
| 0.00380000000000182 | -2.495 |
| 0.00390000000000182 | -2.545 |
| 0.00400000000000182 | -2.595 |
| 0.00410000000000183 | -2.645 |
| 0.00420000000000183 | -2.694 |
| 0.00430000000000183 | -2.744 |
| 0.00440000000000183 | -2.794 |
| 0.00450000000000183 | -2.844 |
| 0.00460000000000183 | -2.893 |
| 0.00470000000000183 | -2.943 |
| 0.00480000000000183 | -2.993 |
| 0.00490000000000183 | -3.043 |
| 0.00500000000000183 | -3.092 |
| 0.00510000000000183 | -3.142 |
| 0.00520000000000183 | -3.192 |
| 0.00530000000000183 | -3.241 |
| 0.00540000000000183 | -3.291 |
| 0.00550000000000183 | -3.341 |
| 0.00560000000000183 | -3.391 |
| 0.00570000000000183 | -3.44 |
| 0.00580000000000183 | -3.49 |
| 0.00590000000000183 | -3.54 |
| 0.00600000000000183 | -3.589 |
| 0.00610000000000183 | -3.639 |
| 0.00620000000000183 | -3.689 |
| 0.00630000000000183 | -3.738 |
| 0.00640000000000183 | -3.788 |
| 0.00650000000000183 | -3.838 |
| 0.00660000000000183 | -3.887 |
| 0.00670000000000183 | -3.937 |
| 0.00680000000000183 | -3.986 |
| 0.00690000000000183 | -4.036 |
| 0.00700000000000183 | -4.086 |
| 0.00710000000000183 | -4.135 |
| 0.00720000000000183 | -4.185 |
| 0.00730000000000183 | -4.235 |
| 0.00740000000000183 | -4.284 |
| 0.00750000000000183 | -4.334 |
| 0.00760000000000183 | -4.383 |
| 0.00770000000000183 | -4.433 |
| 0.00780000000000183 | -4.483 |
| 0.00790000000000183 | -4.532 |
| 0.00800000000000183 | -4.582 |
| 0.00810000000000183 | -4.631 |
| 0.00820000000000183 | -4.681 |
| 0.00830000000000183 | -4.73 |
| 0.00840000000000183 | -4.78 |
| 0.00850000000000183 | -4.829 |
| 0.00860000000000183 | -4.879 |
| 0.00870000000000183 | -4.929 |
| 0.00880000000000183 | -4.978 |
| 0.00890000000000183 | -5.028 |
| 0.00900000000000183 | -5.077 |
| 0.00910000000000183 | -5.127 |
| 0.00920000000000183 | -5.176 |
| 0.00930000000000182 | -5.226 |
| 0.00940000000000182 | -5.275 |
| 0.00950000000000182 | -5.325 |
| 0.00960000000000182 | -5.374 |
| 0.00970000000000182 | -5.424 |
| 0.00980000000000182 | -5.473 |
| 0.00990000000000182 | -5.523 |
| 0.0100000000000018 | -5.572 |
| 0.0101000000000018 | -5.622 |
| 0.0102000000000018 | -5.671 |
| 0.0103000000000018 | -5.721 |
| 0.0104000000000018 | -5.77 |
| 0.0105000000000018 | -5.819 |
| 0.0106000000000018 | -5.869 |
| 0.0107000000000018 | -5.918 |
| 0.0108000000000018 | -5.968 |
| 0.0109000000000018 | -6.017 |
| 0.0110000000000018 | -6.067 |
| 0.0111000000000018 | -6.116 |
| 0.0112000000000018 | -6.165 |
| 0.0113000000000018 | -6.215 |
| 0.0114000000000018 | -6.264 |
| 0.0115000000000018 | -6.314 |
| 0.0116000000000018 | -6.363 |
| 0.0117000000000018 | -6.412 |
| 0.0118000000000018 | -6.462 |
| 0.0119000000000018 | -6.511 |
| 0.0120000000000018 | -6.561 |
| 0.0121000000000018 | -6.61 |
| 0.0122000000000018 | -6.659 |
| 0.0123000000000018 | -6.709 |
| 0.0124000000000018 | -6.758 |
| 0.0125000000000018 | -6.807 |
| 0.0126000000000018 | -6.857 |
| 0.0127000000000018 | -6.906 |
| 0.0128000000000018 | -6.955 |
| 0.0129000000000018 | -7.005 |
| 0.0130000000000018 | -7.054 |
| 0.0131000000000018 | -7.103 |
| 0.0132000000000018 | -7.153 |
| 0.0133000000000018 | -7.202 |
| 0.0134000000000018 | -7.251 |
| 0.0135000000000018 | -7.301 |
| 0.0136000000000018 | -7.35 |
| 0.0137000000000018 | -7.399 |
| 0.0138000000000018 | -7.449 |
| 0.0139000000000018 | -7.498 |
| 0.0140000000000018 | -7.547 |
| 0.0141000000000018 | -7.596 |
| 0.0142000000000018 | -7.646 |
| 0.0143000000000018 | -7.695 |
| 0.0144000000000018 | -7.744 |
| 0.0145000000000018 | -7.793 |
| 0.0146000000000018 | -7.843 |
| 0.0147000000000018 | -7.892 |
| 0.0148000000000018 | -7.941 |
| 0.0149000000000018 | -7.99 |
| 0.0150000000000018 | -8.04 |
| 0.0151000000000018 | -8.089 |
| 0.0152000000000018 | -8.138 |
| 0.0153000000000018 | -8.187 |
| 0.0154000000000018 | -8.237 |
| 0.0155000000000018 | -8.286 |
| 0.0156000000000018 | -8.335 |
| 0.0157000000000018 | -8.384 |
| 0.0158000000000018 | -8.433 |
| 0.0159000000000018 | -8.483 |
| 0.0160000000000018 | -8.532 |
| 0.0161000000000018 | -8.581 |
| 0.0162000000000018 | -8.63 |
| 0.0163000000000018 | -8.679 |
| 0.0164000000000018 | -8.728 |
| 0.0165000000000018 | -8.778 |
| 0.0166000000000018 | -8.827 |
| 0.0167000000000018 | -8.876 |
| 0.0168000000000018 | -8.925 |
| 0.0169000000000018 | -8.974 |
| 0.0170000000000018 | -9.023 |
| 0.0171000000000018 | -9.072 |
| 0.0172000000000018 | -9.122 |
| 0.0173000000000018 | -9.171 |
| 0.0174000000000018 | -9.22 |
| 0.0175000000000018 | -9.269 |
| 0.0176000000000018 | -9.318 |
| 0.0177000000000018 | -9.367 |
| 0.0178000000000018 | -9.416 |
| 0.0179000000000018 | -9.465 |
| 0.0180000000000018 | -9.514 |
| 0.0181000000000018 | -9.563 |
| 0.0182000000000018 | -9.613 |
| 0.0183000000000018 | -9.662 |
| 0.0184000000000018 | -9.711 |
| 0.0185000000000018 | -9.76 |
| 0.0186000000000018 | -9.809 |
| 0.0187000000000018 | -9.858 |
| 0.0188000000000018 | -9.907 |
| 0.0189000000000018 | -9.956 |
| 0.0190000000000018 | -10.005 |
| 0.0191000000000018 | -10.054 |
| 0.0192000000000018 | -10.103 |
| 0.0193000000000018 | -10.152 |
| 0.0194000000000018 | -10.201 |
| 0.0195000000000018 | -10.25 |
| 0.0196000000000018 | -10.299 |
| 0.0197000000000018 | -10.348 |
| 0.0198000000000018 | -10.397 |
| 0.0199000000000018 | -10.446 |
| 0.0200000000000018 | -10.495 |
| 0.0201000000000018 | -10.544 |
| 0.0202000000000018 | -10.593 |
| 0.0203000000000018 | -10.642 |
| 0.0204000000000018 | -10.691 |
| 0.0205000000000018 | -10.74 |
| 0.0206000000000018 | -10.789 |
| 0.0207000000000018 | -10.838 |
| 0.0208000000000018 | -10.887 |
| 0.0209000000000018 | -10.936 |
| 0.0210000000000018 | -10.985 |
| 0.0211000000000018 | -11.034 |
| 0.0212000000000018 | -11.083 |
| 0.0213000000000018 | -11.131 |
| 0.0214000000000018 | -11.18 |
| 0.0215000000000017 | -11.229 |
| 0.0216000000000017 | -11.278 |
| 0.0217000000000017 | -11.327 |
| 0.0218000000000017 | -11.376 |
| 0.0219000000000017 | -11.425 |
| 0.0220000000000017 | -11.474 |
| 0.0221000000000017 | -11.523 |
| 0.0222000000000017 | -11.572 |
| 0.0223000000000017 | -11.62 |
| 0.0224000000000017 | -11.669 |
| 0.0225000000000017 | -11.718 |
| 0.0226000000000017 | -11.767 |
| 0.0227000000000017 | -11.816 |
| 0.0228000000000017 | -11.865 |
| 0.0229000000000017 | -11.914 |
| 0.0230000000000017 | -11.962 |
| 0.0231000000000017 | -12.011 |
| 0.0232000000000017 | -12.06 |
| 0.0233000000000017 | -12.109 |
| 0.0234000000000017 | -12.158 |
| 0.0235000000000017 | -12.207 |
| 0.0236000000000017 | -12.255 |
| 0.0237000000000017 | -12.304 |
| 0.0238000000000017 | -12.353 |
| 0.0239000000000017 | -12.402 |
| 0.0240000000000017 | -12.451 |
| 0.0241000000000017 | -12.499 |
| 0.0242000000000017 | -12.548 |
| 0.0243000000000017 | -12.597 |
| 0.0244000000000017 | -12.646 |
| 0.0245000000000017 | -12.694 |
| 0.0246000000000017 | -12.743 |
| 0.0247000000000017 | -12.792 |
| 0.0248000000000017 | -12.841 |
| 0.0249000000000017 | -12.89 |
| 0.0250000000000017 | -12.938 |
| 0.0251000000000017 | -12.987 |
| 0.0252000000000017 | -13.036 |
| 0.0253000000000017 | -13.084 |
| 0.0254000000000017 | -13.133 |
| 0.0255000000000017 | -13.182 |
| 0.0256000000000017 | -13.231 |
| 0.0257000000000017 | -13.279 |
| 0.0258000000000017 | -13.328 |
| 0.0259000000000017 | -13.377 |
| 0.0260000000000017 | -13.425 |
| 0.0261000000000017 | -13.474 |
| 0.0262000000000017 | -13.523 |
| 0.0263000000000017 | -13.572 |
| 0.0264000000000017 | -13.62 |
| 0.0265000000000017 | -13.669 |
| 0.0266000000000017 | -13.718 |
| 0.0267000000000017 | -13.766 |
| 0.0268000000000017 | -13.815 |
| 0.0269000000000017 | -13.864 |
| 0.0270000000000017 | -13.912 |
| 0.0271000000000017 | -13.961 |
| 0.0272000000000017 | -14.009 |
| 0.0273000000000017 | -14.058 |
| 0.0274000000000017 | -14.107 |
| 0.0275000000000017 | -14.155 |
| 0.0276000000000017 | -14.204 |
| 0.0277000000000017 | -14.253 |
| 0.0278000000000017 | -14.301 |
| 0.0279000000000017 | -14.35 |
| 0.0280000000000017 | -14.398 |
| 0.0281000000000017 | -14.447 |
| 0.0282000000000017 | -14.496 |
| 0.0283000000000017 | -14.544 |
| 0.0284000000000017 | -14.593 |
| 0.0285000000000017 | -14.641 |
| 0.0286000000000017 | -14.69 |
| 0.0287000000000017 | -14.739 |
| 0.0288000000000017 | -14.787 |
| 0.0289000000000017 | -14.836 |
| 0.0290000000000017 | -14.884 |
| 0.0291000000000017 | -14.933 |
| 0.0292000000000017 | -14.981 |
| 0.0293000000000017 | -15.03 |
| 0.0294000000000017 | -15.078 |
| 0.0295000000000017 | -15.127 |
| 0.0296000000000017 | -15.175 |
| 0.0297000000000017 | -15.224 |
| 0.0298000000000017 | -15.272 |
| 0.0299000000000017 | -15.321 |
| 0.0300000000000017 | -15.369 |
| 0.0301000000000017 | -15.418 |
| 0.0302000000000017 | -15.466 |
| 0.0303000000000017 | -15.515 |
| 0.0304000000000017 | -15.563 |
| 0.0305000000000017 | -15.612 |
| 0.0306000000000017 | -15.66 |
| 0.0307000000000017 | -15.709 |
| 0.0308000000000017 | -15.757 |
| 0.0309000000000017 | -15.806 |
| 0.0310000000000017 | -15.854 |
| 0.0311000000000017 | -15.903 |
| 0.0312000000000017 | -15.951 |
| 0.0313000000000017 | -16 |
| 0.0314000000000017 | -16.048 |
| 0.0315000000000017 | -16.096 |
| 0.0316000000000017 | -16.145 |
| 0.0317000000000017 | -16.193 |
| 0.0318000000000017 | -16.242 |
| 0.0319000000000017 | -16.29 |
| 0.0320000000000017 | -16.339 |
| 0.0321000000000017 | -16.387 |
| 0.0322000000000017 | -16.435 |
| 0.0323000000000017 | -16.484 |
| 0.0324000000000017 | -16.532 |
| 0.0325000000000017 | -16.581 |
| 0.0326000000000017 | -16.629 |
| 0.0327000000000017 | -16.677 |
| 0.0328000000000017 | -16.726 |
| 0.0329000000000017 | -16.774 |
| 0.0330000000000017 | -16.822 |
| 0.0331000000000017 | -16.871 |
| 0.0332000000000017 | -16.919 |
| 0.0333000000000017 | -16.967 |
| 0.0334000000000017 | -17.016 |
| 0.0335000000000018 | -17.064 |
| 0.0336000000000018 | -17.113 |
| 0.0337000000000018 | -17.161 |
| 0.0338000000000018 | -17.209 |
| 0.0339000000000018 | -17.257 |
| 0.0340000000000018 | -17.306 |
| 0.0341000000000018 | -17.354 |
| 0.0342000000000018 | -17.402 |
| 0.0343000000000018 | -17.451 |
| 0.0344000000000018 | -17.499 |
| 0.0345000000000018 | -17.547 |
| 0.0346000000000018 | -17.596 |
| 0.0347000000000018 | -17.644 |
| 0.0348000000000018 | -17.692 |
| 0.0349000000000018 | -17.74 |
| 0.0350000000000018 | -17.789 |
| 0.0351000000000018 | -17.837 |
| 0.0352000000000018 | -17.885 |
| 0.0353000000000018 | -17.933 |
| 0.0354000000000018 | -17.982 |
| 0.0355000000000018 | -18.03 |
| 0.0356000000000018 | -18.078 |
| 0.0357000000000018 | -18.126 |
| 0.0358000000000018 | -18.175 |
| 0.0359000000000018 | -18.223 |
| 0.0360000000000018 | -18.271 |
| 0.0361000000000018 | -18.319 |
| 0.0362000000000018 | -18.368 |
| 0.0363000000000018 | -18.416 |
| 0.0364000000000018 | -18.464 |
| 0.0365000000000018 | -18.512 |
| 0.0366000000000018 | -18.56 |
| 0.0367000000000018 | -18.609 |
| 0.0368000000000018 | -18.657 |
| 0.0369000000000018 | -18.705 |
| 0.0370000000000019 | -18.753 |
| 0.0371000000000019 | -18.801 |
| 0.0372000000000019 | -18.849 |
| 0.0373000000000019 | -18.898 |
| 0.0374000000000019 | -18.946 |
| 0.0375000000000019 | -18.994 |
| 0.0376000000000019 | -19.042 |
| 0.0377000000000019 | -19.09 |
| 0.0378000000000019 | -19.138 |
| 0.0379000000000019 | -19.186 |
| 0.0380000000000019 | -19.235 |
| 0.0381000000000019 | -19.283 |
| 0.0382000000000019 | -19.331 |
| 0.0383000000000019 | -19.379 |
| 0.0384000000000019 | -19.427 |
| 0.0385000000000019 | -19.475 |
| 0.0386000000000019 | -19.523 |
| 0.0387000000000019 | -19.571 |
| 0.0388000000000019 | -19.619 |
| 0.0389000000000019 | -19.667 |
| 0.0390000000000019 | -19.716 |
| 0.0391000000000019 | -19.764 |
| 0.0392000000000019 | -19.812 |
| 0.0393000000000019 | -19.86 |
| 0.0394000000000019 | -19.908 |
| 0.0395000000000019 | -19.956 |
| 0.0396000000000019 | -20.004 |
| 0.0397000000000019 | -20.052 |
| 0.0398000000000019 | -20.1 |
| 0.0399000000000019 | -20.148 |
| 0.0400000000000019 | -20.196 |
| 0.0401000000000019 | -20.244 |
| 0.0402000000000019 | -20.292 |
| 0.0403000000000019 | -20.34 |
| 0.0404000000000019 | -20.388 |
| 0.040500000000002 | -20.436 |
| 0.040600000000002 | -20.484 |
| 0.040700000000002 | -20.532 |
| 0.040800000000002 | -20.58 |
| 0.040900000000002 | -20.628 |
| 0.041000000000002 | -20.676 |
| 0.041100000000002 | -20.724 |
| 0.041200000000002 | -20.772 |
| 0.041300000000002 | -20.82 |
| 0.041400000000002 | -20.868 |
| 0.041500000000002 | -20.916 |
| 0.041600000000002 | -20.964 |
| 0.041700000000002 | -21.012 |
| 0.041800000000002 | -21.06 |
| 0.041900000000002 | -21.108 |
| 0.042000000000002 | -21.156 |
| 0.042100000000002 | -21.204 |
| 0.042200000000002 | -21.252 |
| 0.042300000000002 | -21.3 |
| 0.042400000000002 | -21.347 |
| 0.042500000000002 | -21.395 |
| 0.042600000000002 | -21.443 |
| 0.042700000000002 | -21.491 |
| 0.042800000000002 | -21.539 |
| 0.042900000000002 | -21.587 |
| 0.043000000000002 | -21.635 |
| 0.043100000000002 | -21.683 |
| 0.043200000000002 | -21.731 |
| 0.043300000000002 | -21.778 |
| 0.043400000000002 | -21.826 |
| 0.043500000000002 | -21.874 |
| 0.043600000000002 | -21.922 |
| 0.043700000000002 | -21.97 |
| 0.043800000000002 | -22.018 |
| 0.043900000000002 | -22.066 |
| 0.044000000000002 | -22.114 |
| 0.0441000000000021 | -22.161 |
| 0.0442000000000021 | -22.209 |
| 0.0443000000000021 | -22.257 |
| 0.0444000000000021 | -22.305 |
| 0.0445000000000021 | -22.353 |
| 0.0446000000000021 | -22.4 |
| 0.0447000000000021 | -22.448 |
| 0.0448000000000021 | -22.496 |
| 0.0449000000000021 | -22.544 |
| 0.0450000000000021 | -22.592 |
| 0.0451000000000021 | -22.639 |
| 0.0452000000000021 | -22.687 |
| 0.0453000000000021 | -22.735 |
| 0.0454000000000021 | -22.783 |
| 0.0455000000000021 | -22.831 |
| 0.0456000000000021 | -22.878 |
| 0.0457000000000021 | -22.926 |
| 0.0458000000000021 | -22.974 |
| 0.0459000000000021 | -23.022 |
| 0.0460000000000021 | -23.069 |
| 0.0461000000000021 | -23.117 |
| 0.0462000000000021 | -23.165 |
| 0.0463000000000021 | -23.213 |
| 0.0464000000000021 | -23.26 |
| 0.0465000000000021 | -23.308 |
| 0.0466000000000021 | -23.356 |
| 0.0467000000000021 | -23.404 |
| 0.0468000000000021 | -23.451 |
| 0.0469000000000021 | -23.499 |
| 0.0470000000000021 | -23.547 |
| 0.0471000000000021 | -23.594 |
| 0.0472000000000021 | -23.642 |
| 0.0473000000000021 | -23.69 |
| 0.0474000000000021 | -23.737 |
| 0.0475000000000021 | -23.785 |
| 0.0476000000000022 | -23.833 |
| 0.0477000000000022 | -23.88 |
| 0.0478000000000022 | -23.928 |
| 0.0479000000000022 | -23.976 |
| 0.0480000000000022 | -24.023 |
| 0.0481000000000022 | -24.071 |
| 0.0482000000000022 | -24.119 |
| 0.0483000000000022 | -24.166 |
| 0.0484000000000022 | -24.214 |
| 0.0485000000000022 | -24.262 |
| 0.0486000000000022 | -24.309 |
| 0.0487000000000022 | -24.357 |
| 0.0488000000000022 | -24.405 |
| 0.0489000000000022 | -24.452 |
| 0.0490000000000022 | -24.5 |
| 0.0491000000000022 | -24.547 |
| 0.0492000000000022 | -24.595 |
| 0.0493000000000022 | -24.643 |
| 0.0494000000000022 | -24.69 |
| 0.0495000000000022 | -24.738 |
| 0.0496000000000022 | -24.785 |
| 0.0497000000000022 | -24.833 |
| 0.0498000000000022 | -24.88 |
| 0.0499000000000022 | -24.928 |
| 0.0500000000000022 | -24.976 |
| 0.0501000000000022 | -25.023 |
| 0.0502000000000022 | -25.071 |
| 0.0503000000000022 | -25.118 |
| 0.0504000000000022 | -25.166 |
| 0.0505000000000022 | -25.213 |
| 0.0506000000000022 | -25.261 |
| 0.0507000000000022 | -25.308 |
| 0.0508000000000022 | -25.356 |
| 0.0509000000000022 | -25.403 |
| 0.0510000000000022 | -25.451 |
| 0.0511000000000023 | -25.499 |
| 0.0512000000000023 | -25.546 |
| 0.0513000000000023 | -25.594 |
| 0.0514000000000023 | -25.641 |
| 0.0515000000000023 | -25.689 |
| 0.0516000000000023 | -25.736 |
| 0.0517000000000023 | -25.783 |
| 0.0518000000000023 | -25.831 |
| 0.0519000000000023 | -25.878 |
| 0.0520000000000023 | -25.926 |
| 0.0521000000000023 | -25.973 |
| 0.0522000000000023 | -26.021 |
| 0.0523000000000023 | -26.068 |
| 0.0524000000000023 | -26.116 |
| 0.0525000000000023 | -26.163 |
| 0.0526000000000023 | -26.211 |
| 0.0527000000000023 | -26.258 |
| 0.0528000000000023 | -26.306 |
| 0.0529000000000023 | -26.353 |
| 0.0530000000000023 | -26.4 |
| 0.0531000000000023 | -26.448 |
| 0.0532000000000023 | -26.495 |
| 0.0533000000000023 | -26.543 |
| 0.0534000000000023 | -26.59 |
| 0.0535000000000023 | -26.637 |
| 0.0536000000000023 | -26.685 |
| 0.0537000000000023 | -26.732 |
| 0.0538000000000023 | -26.78 |
| 0.0539000000000023 | -26.827 |
| 0.0540000000000023 | -26.874 |
| 0.0541000000000023 | -26.922 |
| 0.0542000000000023 | -26.969 |
| 0.0543000000000023 | -27.017 |
| 0.0544000000000023 | -27.064 |
| 0.0545000000000023 | -27.111 |
| 0.0546000000000024 | -27.159 |
| 0.0547000000000024 | -27.206 |
| 0.0548000000000024 | -27.253 |
| 0.0549000000000024 | -27.301 |
| 0.0550000000000024 | -27.348 |
| 0.0551000000000024 | -27.395 |
| 0.0552000000000024 | -27.443 |
| 0.0553000000000024 | -27.49 |
| 0.0554000000000024 | -27.537 |
| 0.0555000000000024 | -27.585 |
| 0.0556000000000024 | -27.632 |
| 0.0557000000000024 | -27.679 |
| 0.0558000000000024 | -27.726 |
| 0.0559000000000024 | -27.774 |
| 0.0560000000000024 | -27.821 |
| 0.0561000000000024 | -27.868 |
| 0.0562000000000024 | -27.916 |
| 0.0563000000000024 | -27.963 |
| 0.0564000000000024 | -28.01 |
| 0.0565000000000024 | -28.057 |
| 0.0566000000000024 | -28.105 |
| 0.0567000000000024 | -28.152 |
| 0.0568000000000024 | -28.199 |
| 0.0569000000000024 | -28.246 |
| 0.0570000000000024 | -28.294 |
| 0.0571000000000024 | -28.341 |
| 0.0572000000000024 | -28.388 |
| 0.0573000000000024 | -28.435 |
| 0.0574000000000024 | -28.483 |
| 0.0575000000000024 | -28.53 |
| 0.0576000000000024 | -28.577 |
| 0.0577000000000024 | -28.624 |
| 0.0578000000000024 | -28.671 |
| 0.0579000000000024 | -28.719 |
| 0.0580000000000024 | -28.766 |
| 0.0581000000000025 | -28.813 |
| 0.0582000000000025 | -28.86 |
| 0.0583000000000025 | -28.907 |
| 0.0584000000000025 | -28.955 |
| 0.0585000000000025 | -29.002 |
| 0.0586000000000025 | -29.049 |
| 0.0587000000000025 | -29.096 |
| 0.0588000000000025 | -29.143 |
| 0.0589000000000025 | -29.19 |
| 0.0590000000000025 | -29.237 |
| 0.0591000000000025 | -29.285 |
| 0.0592000000000025 | -29.332 |
| 0.0593000000000025 | -29.379 |
| 0.0594000000000025 | -29.426 |
| 0.0595000000000025 | -29.473 |
| 0.0596000000000025 | -29.52 |
| 0.0597000000000025 | -29.567 |
| 0.0598000000000025 | -29.615 |
| 0.0599000000000025 | -29.662 |
| 0.0600000000000025 | -29.709 |
| 0.0601000000000025 | -29.756 |
| 0.0602000000000025 | -29.803 |
| 0.0603000000000025 | -29.85 |
| 0.0604000000000025 | -29.897 |
| 0.0605000000000025 | -29.944 |
| 0.0606000000000025 | -29.991 |
| 0.0607000000000025 | -30.038 |
| 0.0608000000000025 | -30.085 |
| 0.0609000000000025 | -30.132 |
| 0.0610000000000025 | -30.18 |
| 0.0611000000000025 | -30.227 |
| 0.0612000000000025 | -30.274 |
| 0.0613000000000025 | -30.321 |
| 0.0614000000000025 | -30.368 |
| 0.0615000000000025 | -30.415 |
| 0.0616000000000026 | -30.462 |
| 0.0617000000000026 | -30.509 |
| 0.0618000000000026 | -30.556 |
| 0.0619000000000026 | -30.603 |
| 0.0620000000000026 | -30.65 |
| 0.0621000000000026 | -30.697 |
| 0.0622000000000026 | -30.744 |
| 0.0623000000000026 | -30.791 |
| 0.0624000000000026 | -30.838 |
| 0.0625000000000026 | -30.885 |
| 0.0626000000000026 | -30.932 |
| 0.0627000000000026 | -30.979 |
| 0.0628000000000026 | -31.026 |
| 0.0629000000000026 | -31.073 |
| 0.0630000000000026 | -31.12 |
| 0.0631000000000026 | -31.167 |
| 0.0632000000000026 | -31.214 |
| 0.0633000000000026 | -31.261 |
| 0.0634000000000026 | -31.308 |
| 0.0635000000000026 | -31.354 |
| 0.0636000000000026 | -31.401 |
| 0.0637000000000026 | -31.448 |
| 0.0638000000000026 | -31.495 |
| 0.0639000000000026 | -31.542 |
| 0.0640000000000026 | -31.589 |
| 0.0641000000000026 | -31.636 |
| 0.0642000000000026 | -31.683 |
| 0.0643000000000026 | -31.73 |
| 0.0644000000000026 | -31.777 |
| 0.0645000000000026 | -31.824 |
| 0.0646000000000026 | -31.871 |
| 0.0647000000000026 | -31.917 |
| 0.0648000000000026 | -31.964 |
| 0.0649000000000026 | -32.011 |
| 0.0650000000000026 | -32.058 |
| 0.0651000000000026 | -32.105 |
| 0.0652000000000026 | -32.152 |
| 0.0653000000000026 | -32.199 |
| 0.0654000000000027 | -32.246 |
| 0.0655000000000027 | -32.292 |
| 0.0656000000000027 | -32.339 |
| 0.0657000000000027 | -32.386 |
| 0.0658000000000027 | -32.433 |
| 0.0659000000000027 | -32.48 |
| 0.0660000000000027 | -32.527 |
| 0.0661000000000027 | -32.573 |
| 0.0662000000000027 | -32.62 |
| 0.0663000000000027 | -32.667 |
| 0.0664000000000027 | -32.714 |
| 0.0665000000000027 | -32.761 |
| 0.0666000000000027 | -32.808 |
| 0.0667000000000027 | -32.854 |
| 0.0668000000000027 | -32.901 |
| 0.0669000000000027 | -32.948 |
| 0.0670000000000027 | -32.995 |
| 0.0671000000000027 | -33.041 |
| 0.0672000000000027 | -33.088 |
| 0.0673000000000027 | -33.135 |
| 0.0674000000000027 | -33.182 |
| 0.0675000000000027 | -33.229 |
| 0.0676000000000027 | -33.275 |
| 0.0677000000000027 | -33.322 |
| 0.0678000000000027 | -33.369 |
| 0.0679000000000027 | -33.416 |
| 0.0680000000000027 | -33.462 |
| 0.0681000000000027 | -33.509 |
| 0.0682000000000027 | -33.556 |
| 0.0683000000000027 | -33.602 |
| 0.0684000000000027 | -33.649 |
| 0.0685000000000027 | -33.696 |
| 0.0686000000000027 | -33.743 |
| 0.0687000000000027 | -33.789 |
| 0.0688000000000027 | -33.836 |
| 0.0689000000000028 | -33.883 |
| 0.0690000000000028 | -33.929 |
| 0.0691000000000028 | -33.976 |
| 0.0692000000000028 | -34.023 |
| 0.0693000000000028 | -34.069 |
| 0.0694000000000028 | -34.116 |
| 0.0695000000000028 | -34.163 |
| 0.0696000000000028 | -34.21 |
| 0.0697000000000028 | -34.256 |
| 0.0698000000000028 | -34.303 |
| 0.0699000000000028 | -34.349 |
| 0.0700000000000028 | -34.396 |
| 0.0701000000000028 | -34.443 |
| 0.0702000000000028 | -34.489 |
| 0.0703000000000028 | -34.536 |
| 0.0704000000000028 | -34.583 |
| 0.0705000000000028 | -34.629 |
| 0.0706000000000028 | -34.676 |
| 0.0707000000000028 | -34.723 |
| 0.0708000000000028 | -34.769 |
| 0.0709000000000028 | -34.816 |
| 0.0710000000000028 | -34.862 |
| 0.0711000000000028 | -34.909 |
| 0.0712000000000028 | -34.956 |
| 0.0713000000000028 | -35.002 |
| 0.0714000000000028 | -35.049 |
| 0.0715000000000028 | -35.095 |
| 0.0716000000000028 | -35.142 |
| 0.0717000000000028 | -35.188 |
| 0.0718000000000028 | -35.235 |
| 0.0719000000000028 | -35.282 |
| 0.0720000000000028 | -35.328 |
| 0.0721000000000028 | -35.375 |
| 0.0722000000000029 | -35.421 |
| 0.0723000000000029 | -35.468 |
| 0.0724000000000029 | -35.514 |
| 0.0725000000000029 | -35.561 |
| 0.0726000000000029 | -35.607 |
| 0.0727000000000029 | -35.654 |
| 0.0728000000000029 | -35.701 |
| 0.0729000000000029 | -35.747 |
| 0.0730000000000029 | -35.794 |
| 0.0731000000000029 | -35.84 |
| 0.0732000000000029 | -35.887 |
| 0.0733000000000029 | -35.933 |
| 0.0734000000000029 | -35.98 |
| 0.0735000000000029 | -36.026 |
| 0.0736000000000029 | -36.073 |
| 0.0737000000000029 | -36.119 |
| 0.0738000000000029 | -36.165 |
| 0.0739000000000029 | -36.212 |
| 0.0740000000000029 | -36.258 |
| 0.0741000000000029 | -36.305 |
| 0.0742000000000029 | -36.351 |
| 0.0743000000000029 | -36.398 |
| 0.0744000000000029 | -36.444 |
| 0.0745000000000029 | -36.491 |
| 0.0746000000000029 | -36.537 |
| 0.0747000000000029 | -36.584 |
| 0.0748000000000029 | -36.63 |
| 0.0749000000000029 | -36.676 |
| 0.0750000000000029 | -36.723 |
| 0.0751000000000029 | -36.769 |
| 0.0752000000000029 | -36.816 |
| 0.0753000000000029 | -36.862 |
| 0.0754000000000029 | -36.909 |
| 0.0755000000000029 | -36.955 |
| 0.0756000000000029 | -37.001 |
| 0.075700000000003 | -37.048 |
| 0.075800000000003 | -37.094 |
| 0.075900000000003 | -37.141 |
| 0.076000000000003 | -37.187 |
| 0.076100000000003 | -37.233 |
| 0.076200000000003 | -37.28 |
| 0.076300000000003 | -37.326 |
| 0.076400000000003 | -37.372 |
| 0.076500000000003 | -37.419 |
| 0.076600000000003 | -37.465 |
| 0.076700000000003 | -37.511 |
| 0.076800000000003 | -37.558 |
| 0.076900000000003 | -37.604 |
| 0.077000000000003 | -37.65 |
| 0.077100000000003 | -37.697 |
| 0.077200000000003 | -37.743 |
| 0.077300000000003 | -37.789 |
| 0.077400000000003 | -37.836 |
| 0.077500000000003 | -37.882 |
| 0.077600000000003 | -37.928 |
| 0.077700000000003 | -37.975 |
| 0.077800000000003 | -38.021 |
| 0.077900000000003 | -38.067 |
| 0.078000000000003 | -38.114 |
| 0.078100000000003 | -38.16 |
| 0.078200000000003 | -38.206 |
| 0.078300000000003 | -38.252 |
| 0.078400000000003 | -38.299 |
| 0.078500000000003 | -38.345 |
| 0.078600000000003 | -38.391 |
| 0.078700000000003 | -38.437 |
| 0.078800000000003 | -38.484 |
| 0.078900000000003 | -38.53 |
| 0.079000000000003 | -38.576 |
| 0.079100000000003 | -38.622 |
| 0.0792000000000031 | -38.669 |
| 0.0793000000000031 | -38.715 |
| 0.0794000000000031 | -38.761 |
| 0.0795000000000031 | -38.807 |
| 0.0796000000000031 | -38.854 |
| 0.0797000000000031 | -38.9 |
| 0.0798000000000031 | -38.946 |
| 0.0799000000000031 | -38.992 |
| 0.0800000000000031 | -39.038 |
| 0.0801000000000031 | -39.085 |
| 0.0802000000000031 | -39.131 |
| 0.0803000000000031 | -39.177 |
| 0.0804000000000031 | -39.223 |
| 0.0805000000000031 | -39.269 |
| 0.0806000000000031 | -39.316 |
| 0.0807000000000031 | -39.362 |
| 0.0808000000000031 | -39.408 |
| 0.0809000000000031 | -39.454 |
| 0.0810000000000031 | -39.5 |
| 0.0811000000000031 | -39.546 |
| 0.0812000000000031 | -39.593 |
| 0.0813000000000031 | -39.639 |
| 0.0814000000000031 | -39.685 |
| 0.0815000000000031 | -39.731 |
| 0.0816000000000031 | -39.777 |
| 0.0817000000000031 | -39.823 |
| 0.0818000000000031 | -39.869 |
| 0.0819000000000031 | -39.915 |
| 0.0820000000000031 | -39.962 |
| 0.0821000000000031 | -40.008 |
| 0.0822000000000031 | -40.054 |
| 0.0823000000000031 | -40.1 |
| 0.0824000000000031 | -40.146 |
| 0.0825000000000031 | -40.192 |
| 0.0826000000000031 | -40.238 |
| 0.0827000000000031 | -40.284 |
| 0.0828000000000031 | -40.33 |
| 0.0829000000000031 | -40.376 |
| 0.0830000000000032 | -40.422 |
| 0.0831000000000032 | -40.469 |
| 0.0832000000000032 | -40.515 |
| 0.0833000000000032 | -40.561 |
| 0.0834000000000032 | -40.607 |
| 0.0835000000000032 | -40.653 |
| 0.0836000000000032 | -40.699 |
| 0.0837000000000032 | -40.745 |
| 0.0838000000000032 | -40.791 |
| 0.0839000000000032 | -40.837 |
| 0.0840000000000032 | -40.883 |
| 0.0841000000000032 | -40.929 |
| 0.0842000000000032 | -40.975 |
| 0.0843000000000032 | -41.021 |
| 0.0844000000000032 | -41.067 |
| 0.0845000000000032 | -41.113 |
| 0.0846000000000032 | -41.159 |
| 0.0847000000000032 | -41.205 |
| 0.0848000000000032 | -41.251 |
| 0.0849000000000032 | -41.297 |
| 0.0850000000000032 | -41.343 |
| 0.0851000000000032 | -41.389 |
| 0.0852000000000032 | -41.435 |
| 0.0853000000000032 | -41.481 |
| 0.0854000000000032 | -41.527 |
| 0.0855000000000032 | -41.573 |
| 0.0856000000000032 | -41.619 |
| 0.0857000000000032 | -41.665 |
| 0.0858000000000032 | -41.711 |
| 0.0859000000000032 | -41.757 |
| 0.0860000000000032 | -41.802 |
| 0.0861000000000032 | -41.848 |
| 0.0862000000000032 | -41.894 |
| 0.0863000000000032 | -41.94 |
| 0.0864000000000032 | -41.986 |
| 0.0865000000000033 | -42.032 |
| 0.0866000000000033 | -42.078 |
| 0.0867000000000033 | -42.124 |
| 0.0868000000000033 | -42.17 |
| 0.0869000000000033 | -42.216 |
| 0.0870000000000033 | -42.262 |
| 0.0871000000000033 | -42.308 |
| 0.0872000000000033 | -42.353 |
| 0.0873000000000033 | -42.399 |
| 0.0874000000000033 | -42.445 |
| 0.0875000000000033 | -42.491 |
| 0.0876000000000033 | -42.537 |
| 0.0877000000000033 | -42.583 |
| 0.0878000000000033 | -42.629 |
| 0.0879000000000033 | -42.674 |
| 0.0880000000000033 | -42.72 |
| 0.0881000000000033 | -42.766 |
| 0.0882000000000033 | -42.812 |
| 0.0883000000000033 | -42.858 |
| 0.0884000000000033 | -42.904 |
| 0.0885000000000033 | -42.949 |
| 0.0886000000000033 | -42.995 |
| 0.0887000000000033 | -43.041 |
| 0.0888000000000033 | -43.087 |
| 0.0889000000000033 | -43.133 |
| 0.0890000000000033 | -43.179 |
| 0.0891000000000033 | -43.224 |
| 0.0892000000000033 | -43.27 |
| 0.0893000000000033 | -43.316 |
| 0.0894000000000033 | -43.362 |
| 0.0895000000000033 | -43.408 |
| 0.0896000000000033 | -43.453 |
| 0.0897000000000033 | -43.499 |
| 0.0898000000000033 | -43.545 |
| 0.0899000000000033 | -43.591 |
| 0.0900000000000033 | -43.636 |
| 0.0901000000000033 | -43.682 |
| 0.0902000000000034 | -43.728 |
| 0.0903000000000034 | -43.774 |
| 0.0904000000000034 | -43.819 |
| 0.0905000000000034 | -43.865 |
| 0.0906000000000034 | -43.911 |
| 0.0907000000000034 | -43.957 |
| 0.0908000000000034 | -44.002 |
| 0.0909000000000034 | -44.048 |
| 0.0910000000000034 | -44.094 |
| 0.0911000000000034 | -44.139 |
| 0.0912000000000034 | -44.185 |
| 0.0913000000000034 | -44.231 |
| 0.0914000000000034 | -44.277 |
| 0.0915000000000034 | -44.322 |
| 0.0916000000000034 | -44.368 |
| 0.0917000000000034 | -44.414 |
| 0.0918000000000034 | -44.459 |
| 0.0919000000000034 | -44.505 |
| 0.0920000000000034 | -44.551 |
| 0.0921000000000034 | -44.596 |
| 0.0922000000000034 | -44.642 |
| 0.0923000000000034 | -44.688 |
| 0.0924000000000034 | -44.733 |
| 0.0925000000000034 | -44.779 |
| 0.0926000000000034 | -44.825 |
| 0.0927000000000034 | -44.87 |
| 0.0928000000000034 | -44.916 |
| 0.0929000000000034 | -44.962 |
| 0.0930000000000034 | -45.007 |
| 0.0931000000000034 | -45.053 |
| 0.0932000000000034 | -45.098 |
| 0.0933000000000034 | -45.144 |
| 0.0934000000000034 | -45.19 |
| 0.0935000000000034 | -45.235 |
| 0.0936000000000034 | -45.281 |
| 0.0937000000000034 | -45.326 |
| 0.0938000000000035 | -45.372 |
| 0.0939000000000035 | -45.418 |
| 0.0940000000000035 | -45.463 |
| 0.0941000000000035 | -45.509 |
| 0.0942000000000035 | -45.554 |
| 0.0943000000000035 | -45.6 |
| 0.0944000000000035 | -45.646 |
| 0.0945000000000035 | -45.691 |
| 0.0946000000000035 | -45.737 |
| 0.0947000000000035 | -45.782 |
| 0.0948000000000035 | -45.828 |
| 0.0949000000000035 | -45.873 |
| 0.0950000000000035 | -45.919 |
| 0.0951000000000035 | -45.964 |
| 0.0952000000000035 | -46.01 |
| 0.0953000000000035 | -46.055 |
| 0.0954000000000035 | -46.101 |
| 0.0955000000000035 | -46.147 |
| 0.0956000000000035 | -46.192 |
| 0.0957000000000035 | -46.238 |
| 0.0958000000000035 | -46.283 |
| 0.0959000000000035 | -46.329 |
| 0.0960000000000035 | -46.374 |
| 0.0961000000000035 | -46.42 |
| 0.0962000000000035 | -46.465 |
| 0.0963000000000035 | -46.511 |
| 0.0964000000000035 | -46.556 |
| 0.0965000000000035 | -46.601 |
| 0.0966000000000035 | -46.647 |
| 0.0967000000000035 | -46.692 |
| 0.0968000000000035 | -46.738 |
| 0.0969000000000035 | -46.783 |
| 0.0970000000000035 | -46.829 |
| 0.0971000000000035 | -46.874 |
| 0.0972000000000035 | -46.92 |
| 0.0973000000000036 | -46.965 |
| 0.0974000000000036 | -47.011 |
| 0.0975000000000036 | -47.056 |
| 0.0976000000000036 | -47.101 |
| 0.0977000000000036 | -47.147 |
| 0.0978000000000036 | -47.192 |
| 0.0979000000000036 | -47.238 |
| 0.0980000000000036 | -47.283 |
| 0.0981000000000036 | -47.329 |
| 0.0982000000000036 | -47.374 |
| 0.0983000000000036 | -47.419 |
| 0.0984000000000036 | -47.465 |
| 0.0985000000000036 | -47.51 |
| 0.0986000000000036 | -47.556 |
| 0.0987000000000036 | -47.601 |
| 0.0988000000000036 | -47.646 |
| 0.0989000000000036 | -47.692 |
| 0.0990000000000036 | -47.737 |
| 0.0991000000000036 | -47.782 |
| 0.0992000000000036 | -47.828 |
| 0.0993000000000036 | -47.873 |
| 0.0994000000000036 | -47.918 |
| 0.0995000000000036 | -47.964 |
| 0.0996000000000036 | -48.009 |
| 0.0997000000000036 | -48.054 |
| 0.0998000000000036 | -48.1 |
| 0.0999000000000036 | -48.145 |
| 0.100000000000004 | -48.19 |